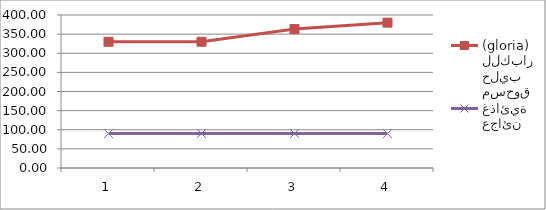
| Category | مسحوق حليب للكبار  (gloria) | عجائن غذائية |
|---|---|---|
| 0 | 330 | 90 |
| 1 | 330 | 90 |
| 2 | 363.33 | 90 |
| 3 | 380 | 90 |